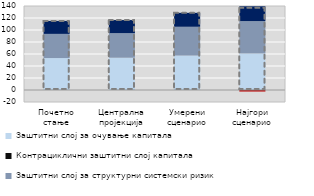
| Category | Заштитни слој за очување капитала | Контрациклични заштитни слој капитала | Заштитни слој за структурни системски ризик | Заштитни слој за системски значајне банке |
|---|---|---|---|---|
| Почетно 
стање | 53264240 | 0 | 40252969 | 21608633 |
| Централна пројекција | 53820896.486 | 0 | 40967982.488 | 21769101.473 |
| Умерени сценарио | 57472467.258 | 0 | 47906829.538 | 23236476.855 |
| Најгори сценарио | 60925732.147 | 0 | 53941957.18 | 24625031.971 |